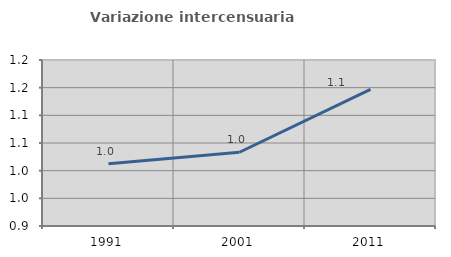
| Category | Variazione intercensuaria annua |
|---|---|
| 1991.0 | 1.012 |
| 2001.0 | 1.033 |
| 2011.0 | 1.147 |